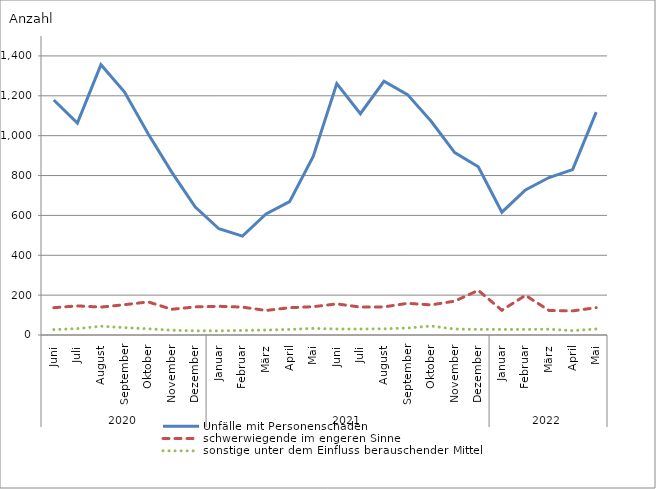
| Category | Unfälle mit Personenschaden | schwerwiegende im engeren Sinne | sonstige unter dem Einfluss berauschender Mittel |
|---|---|---|---|
| 0 | 1179 | 137 | 27 |
| 1 | 1063 | 146 | 32 |
| 2 | 1356 | 140 | 44 |
| 3 | 1219 | 152 | 37 |
| 4 | 1010 | 166 | 31 |
| 5 | 817 | 129 | 24 |
| 6 | 642 | 141 | 21 |
| 7 | 533 | 144 | 21 |
| 8 | 496 | 140 | 23 |
| 9 | 607 | 123 | 25 |
| 10 | 669 | 137 | 28 |
| 11 | 896 | 142 | 33 |
| 12 | 1261 | 156 | 30 |
| 13 | 1110 | 140 | 30 |
| 14 | 1273 | 141 | 31 |
| 15 | 1206 | 159 | 35 |
| 16 | 1072 | 151 | 45 |
| 17 | 915 | 170 | 30 |
| 18 | 844 | 224 | 28 |
| 19 | 616 | 124 | 28 |
| 20 | 728 | 199 | 28 |
| 21 | 790 | 123 | 29 |
| 22 | 830 | 121 | 22 |
| 23 | 1118 | 137 | 30 |